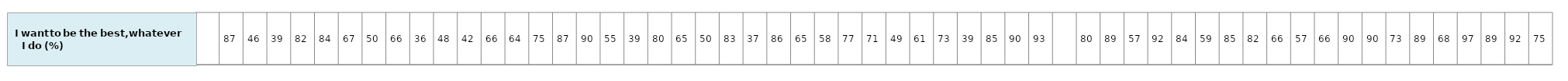
| Category | I want to be the best, whatever I do |
|---|---|
| nan | 1 |
| 86.66644076 | 1 |
| 46.20885821 | 1 |
| 39.32805261 | 1 |
| 81.82563970000001 | 1 |
| 83.52363258 | 1 |
| 66.90988053 | 1 |
| 49.796109799999996 | 1 |
| 65.65717099 | 1 |
| 36.16597825 | 1 |
| 47.62916691 | 1 |
| 41.51665671 | 1 |
| 66.21781023 | 1 |
| 64.22823203 | 1 |
| 75.0144713 | 1 |
| 86.72458242 | 1 |
| 90.31720267 | 1 |
| 55.29630686 | 1 |
| 38.74450399 | 1 |
| 80.08777739 | 1 |
| 64.85697379 | 1 |
| 50.266589769999996 | 1 |
| 83.09972449 | 1 |
| 36.97730801 | 1 |
| 85.55348282 | 1 |
| 64.77520118 | 1 |
| 58.02126837 | 1 |
| 76.77815942000001 | 1 |
| 70.51460444 | 1 |
| 49.42611167 | 1 |
| 61.31120335999999 | 1 |
| 72.99700236999999 | 1 |
| 39.298167899999996 | 1 |
| 85.46619541999999 | 1 |
| 89.65310597999999 | 1 |
| 93.24105399999999 | 1 |
| nan | 1 |
| 80.18510266 | 1 |
| 88.81055724 | 1 |
| 57.437113960000005 | 1 |
| 91.94368684 | 1 |
| 84.17052 | 1 |
| 59.23767257 | 1 |
| 84.76239738 | 1 |
| 82.48433293 | 1 |
| 66.4739421 | 1 |
| 57.06670663 | 1 |
| 66.01585936 | 1 |
| 89.68495321 | 1 |
| 89.97057397 | 1 |
| 73.10626595 | 1 |
| 88.56274378 | 1 |
| 68.38221862 | 1 |
| 97.22828793 | 1 |
| 89.41525307 | 1 |
| 92.24637131 | 1 |
| 75.41520352 | 1 |